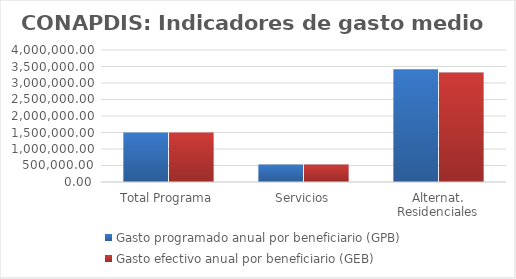
| Category | Gasto programado anual por beneficiario (GPB)  | Gasto efectivo anual por beneficiario (GEB)  |
|---|---|---|
| Total Programa | 1501012.361 | 1500647.763 |
| Servicios | 529281.975 | 529633.511 |
| Alternat. Residenciales | 3413974.184 | 3316203.118 |